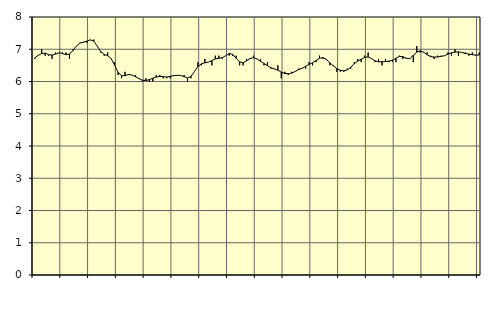
| Category | Piggar | Transport, SNI 49-53 |
|---|---|---|
| nan | 6.7 | 6.73 |
| 87.0 | 6.8 | 6.81 |
| 87.0 | 7 | 6.87 |
| 87.0 | 6.8 | 6.88 |
| nan | 6.8 | 6.83 |
| 88.0 | 6.7 | 6.82 |
| 88.0 | 6.9 | 6.85 |
| 88.0 | 6.9 | 6.89 |
| nan | 6.9 | 6.87 |
| 89.0 | 6.9 | 6.83 |
| 89.0 | 6.7 | 6.85 |
| 89.0 | 7 | 6.96 |
| nan | 7.1 | 7.1 |
| 90.0 | 7.2 | 7.19 |
| 90.0 | 7.2 | 7.22 |
| 90.0 | 7.2 | 7.25 |
| nan | 7.3 | 7.29 |
| 91.0 | 7.3 | 7.25 |
| 91.0 | 7.1 | 7.1 |
| 91.0 | 6.9 | 6.93 |
| nan | 6.8 | 6.84 |
| 92.0 | 6.9 | 6.8 |
| 92.0 | 6.7 | 6.71 |
| 92.0 | 6.6 | 6.51 |
| nan | 6.2 | 6.29 |
| 93.0 | 6.1 | 6.18 |
| 93.0 | 6.3 | 6.18 |
| 93.0 | 6.2 | 6.22 |
| nan | 6.2 | 6.2 |
| 94.0 | 6.2 | 6.15 |
| 94.0 | 6.1 | 6.09 |
| 94.0 | 6 | 6.04 |
| nan | 6.1 | 6.03 |
| 95.0 | 6 | 6.06 |
| 95.0 | 6 | 6.1 |
| 95.0 | 6.2 | 6.14 |
| nan | 6.2 | 6.16 |
| 96.0 | 6.1 | 6.15 |
| 96.0 | 6.1 | 6.14 |
| 96.0 | 6.1 | 6.16 |
| nan | 6.2 | 6.18 |
| 97.0 | 6.2 | 6.19 |
| 97.0 | 6.2 | 6.19 |
| 97.0 | 6.2 | 6.15 |
| nan | 6 | 6.11 |
| 98.0 | 6.1 | 6.16 |
| 98.0 | 6.3 | 6.31 |
| 98.0 | 6.6 | 6.46 |
| nan | 6.5 | 6.55 |
| 99.0 | 6.7 | 6.58 |
| 99.0 | 6.6 | 6.6 |
| 99.0 | 6.5 | 6.65 |
| nan | 6.8 | 6.7 |
| 0.0 | 6.8 | 6.72 |
| 0.0 | 6.7 | 6.74 |
| 0.0 | 6.8 | 6.8 |
| nan | 6.8 | 6.87 |
| 1.0 | 6.8 | 6.84 |
| 1.0 | 6.8 | 6.72 |
| 1.0 | 6.5 | 6.61 |
| nan | 6.5 | 6.58 |
| 2.0 | 6.7 | 6.64 |
| 2.0 | 6.7 | 6.71 |
| 2.0 | 6.8 | 6.74 |
| nan | 6.7 | 6.7 |
| 3.0 | 6.7 | 6.63 |
| 3.0 | 6.5 | 6.56 |
| 3.0 | 6.6 | 6.49 |
| nan | 6.4 | 6.43 |
| 4.0 | 6.4 | 6.39 |
| 4.0 | 6.5 | 6.35 |
| 4.0 | 6.1 | 6.29 |
| nan | 6.3 | 6.25 |
| 5.0 | 6.2 | 6.24 |
| 5.0 | 6.3 | 6.26 |
| 5.0 | 6.3 | 6.31 |
| nan | 6.4 | 6.37 |
| 6.0 | 6.4 | 6.41 |
| 6.0 | 6.4 | 6.47 |
| 6.0 | 6.6 | 6.53 |
| nan | 6.5 | 6.58 |
| 7.0 | 6.6 | 6.65 |
| 7.0 | 6.8 | 6.72 |
| 7.0 | 6.7 | 6.74 |
| nan | 6.7 | 6.68 |
| 8.0 | 6.5 | 6.58 |
| 8.0 | 6.5 | 6.48 |
| 8.0 | 6.3 | 6.4 |
| nan | 6.3 | 6.35 |
| 9.0 | 6.3 | 6.33 |
| 9.0 | 6.4 | 6.36 |
| 9.0 | 6.4 | 6.44 |
| nan | 6.6 | 6.55 |
| 10.0 | 6.7 | 6.63 |
| 10.0 | 6.6 | 6.69 |
| 10.0 | 6.8 | 6.75 |
| nan | 6.9 | 6.76 |
| 11.0 | 6.7 | 6.71 |
| 11.0 | 6.6 | 6.64 |
| 11.0 | 6.7 | 6.61 |
| nan | 6.5 | 6.61 |
| 12.0 | 6.7 | 6.62 |
| 12.0 | 6.6 | 6.63 |
| 12.0 | 6.6 | 6.66 |
| nan | 6.6 | 6.72 |
| 13.0 | 6.8 | 6.78 |
| 13.0 | 6.7 | 6.77 |
| 13.0 | 6.7 | 6.72 |
| nan | 6.7 | 6.71 |
| 14.0 | 6.6 | 6.81 |
| 14.0 | 7.1 | 6.91 |
| 14.0 | 6.9 | 6.95 |
| nan | 6.9 | 6.91 |
| 15.0 | 6.9 | 6.83 |
| 15.0 | 6.8 | 6.77 |
| 15.0 | 6.7 | 6.76 |
| nan | 6.8 | 6.76 |
| 16.0 | 6.8 | 6.78 |
| 16.0 | 6.8 | 6.8 |
| 16.0 | 6.9 | 6.85 |
| nan | 6.8 | 6.89 |
| 17.0 | 7 | 6.91 |
| 17.0 | 6.8 | 6.92 |
| 17.0 | 6.9 | 6.9 |
| nan | 6.9 | 6.87 |
| 18.0 | 6.8 | 6.85 |
| 18.0 | 6.9 | 6.83 |
| 18.0 | 6.8 | 6.82 |
| nan | 6.9 | 6.82 |